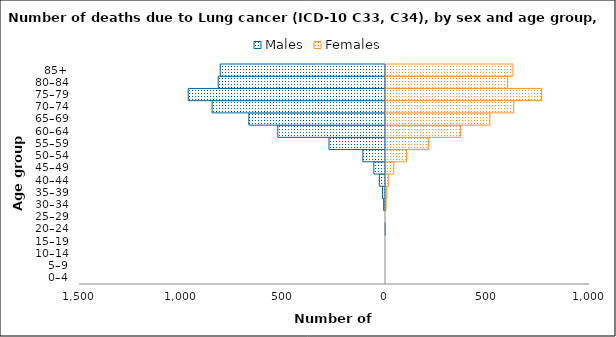
| Category | Males | Females |
|---|---|---|
| 0–4 | 0 | 0 |
| 5–9 | 0 | 0 |
| 10–14 | 0 | 0 |
| 15–19 | 0 | 0 |
| 20–24 | -1 | 0 |
| 25–29 | 0 | 0 |
| 30–34 | -9 | 5 |
| 35–39 | -15 | 9 |
| 40–44 | -30 | 16 |
| 45–49 | -57 | 43 |
| 50–54 | -111 | 106 |
| 55–59 | -277 | 214 |
| 60–64 | -528 | 370 |
| 65–69 | -670 | 514 |
| 70–74 | -850 | 631 |
| 75–79 | -967 | 767 |
| 80–84 | -820 | 601 |
| 85+ | -810 | 627 |